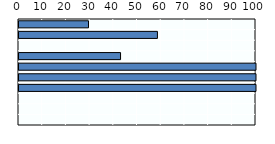
| Category | Payment rate (%) across father-specific leave |
|---|---|
| Korea | 29.325 |
| Japan | 58.407 |
| OECD average | 0 |
| Australia | 42.852 |
| Singapore | 100 |
| Viet Nam | 100 |
| Indonesia | 100 |
| New Zealand | 0 |
| Thailand | 0 |
| China | 0 |